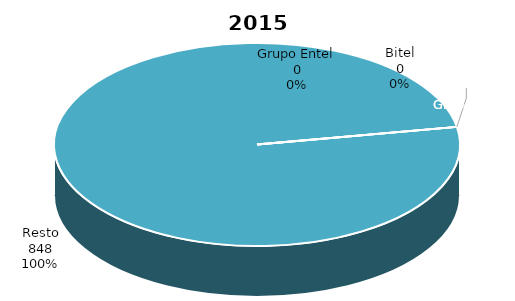
| Category | Series 0 |
|---|---|
| Grupo Telefónica | 0 |
| Grupo Claro | 0 |
| Grupo Entel | 0 |
| Bitel | 0 |
| Resto | 847.751 |